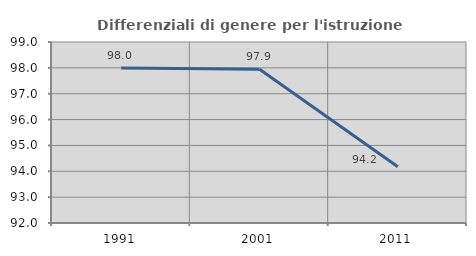
| Category | Differenziali di genere per l'istruzione superiore |
|---|---|
| 1991.0 | 97.996 |
| 2001.0 | 97.946 |
| 2011.0 | 94.174 |